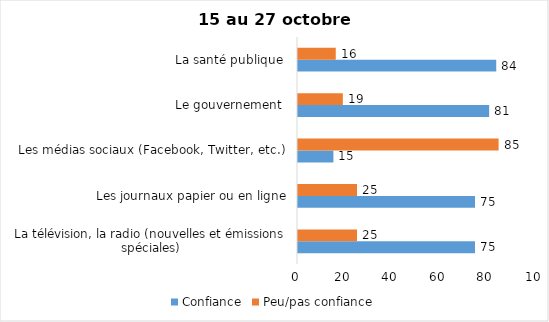
| Category | Confiance | Peu/pas confiance |
|---|---|---|
| La télévision, la radio (nouvelles et émissions spéciales) | 75 | 25 |
| Les journaux papier ou en ligne | 75 | 25 |
| Les médias sociaux (Facebook, Twitter, etc.) | 15 | 85 |
| Le gouvernement  | 81 | 19 |
| La santé publique  | 84 | 16 |